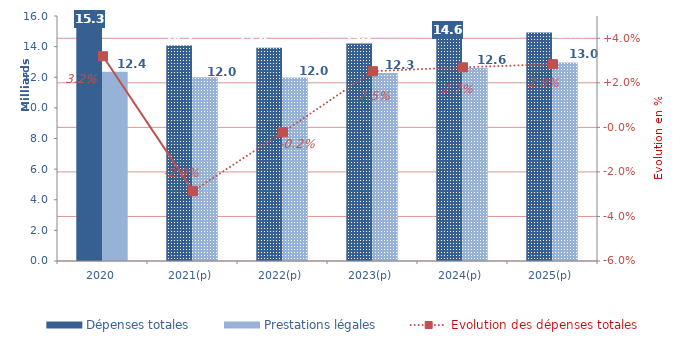
| Category | Dépenses totales | Prestations légales |
|---|---|---|
| 2020 | 15253.661 | 12357.206 |
| 2021(p) | 14070.993 | 12003.47 |
| 2022(p) | 13923.704 | 11977.532 |
| 2023(p) | 14197.509 | 12279.561 |
| 2024(p) | 14550.743 | 12610.646 |
| 2025(p) | 14926.923 | 12968.532 |